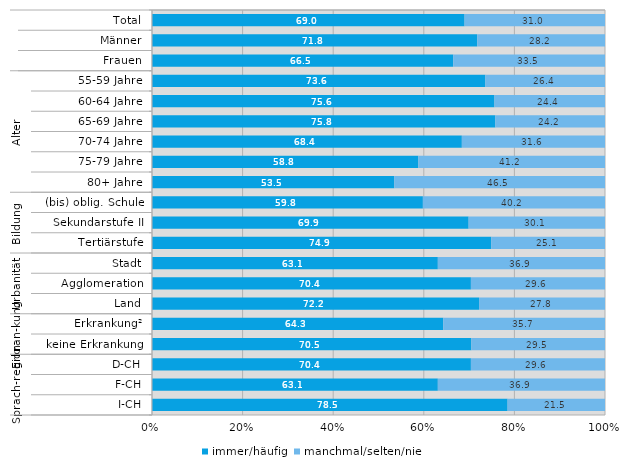
| Category | immer/häufig | manchmal/selten/nie |
|---|---|---|
| 0 | 69 | 31 |
| 1 | 71.8 | 28.2 |
| 2 | 66.5 | 33.5 |
| 3 | 73.6 | 26.4 |
| 4 | 75.6 | 24.4 |
| 5 | 75.8 | 24.2 |
| 6 | 68.4 | 31.6 |
| 7 | 58.8 | 41.2 |
| 8 | 53.5 | 46.5 |
| 9 | 59.8 | 40.2 |
| 10 | 69.9 | 30.1 |
| 11 | 74.9 | 25.1 |
| 12 | 63.1 | 36.9 |
| 13 | 70.4 | 29.6 |
| 14 | 72.2 | 27.8 |
| 15 | 64.3 | 35.7 |
| 16 | 70.5 | 29.5 |
| 17 | 70.4 | 29.6 |
| 18 | 63.1 | 36.9 |
| 19 | 78.5 | 21.5 |